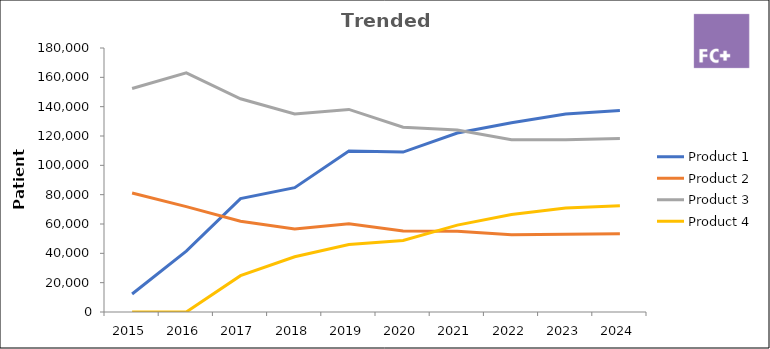
| Category | Product 1 | Product 2 | Product 3 | Product 4 |
|---|---|---|---|---|
| 2015.0 | 12288.113 | 81101.543 | 152372.595 | 0 |
| 2016.0 | 41455.252 | 71855.77 | 163057.323 | 0 |
| 2017.0 | 77342.437 | 61873.95 | 145403.782 | 24749.58 |
| 2018.0 | 84796.97 | 56531.313 | 135047.026 | 37687.542 |
| 2019.0 | 109793.717 | 60209.457 | 138127.579 | 46042.526 |
| 2020.0 | 109024.927 | 55304.578 | 126002.552 | 48767.757 |
| 2021.0 | 122057.755 | 55068.425 | 124023.68 | 59252.045 |
| 2022.0 | 129067.431 | 52697.615 | 117375.069 | 66416.271 |
| 2023.0 | 134986.514 | 53011.515 | 117524.48 | 70891.602 |
| 2024.0 | 137393.241 | 53430.705 | 118310.847 | 72513.1 |